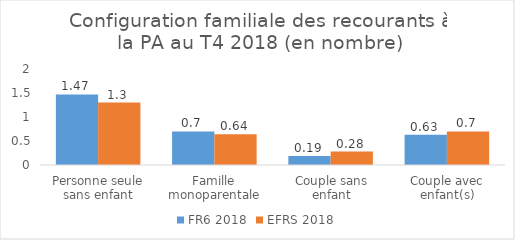
| Category | FR6 2018 | EFRS 2018 |
|---|---|---|
| Personne seule sans enfant | 1.47 | 1.3 |
| Famille monoparentale | 0.7 | 0.64 |
| Couple sans enfant | 0.19 | 0.28 |
| Couple avec enfant(s) | 0.63 | 0.7 |